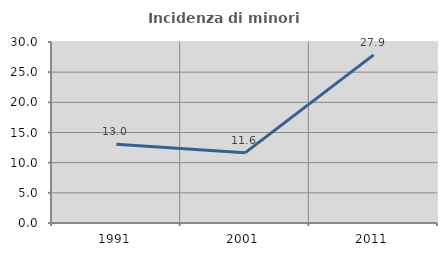
| Category | Incidenza di minori stranieri |
|---|---|
| 1991.0 | 13.043 |
| 2001.0 | 11.628 |
| 2011.0 | 27.857 |